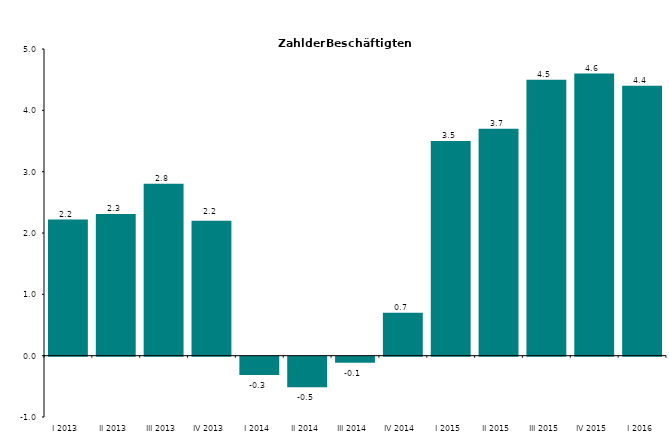
| Category | Series 0 |
|---|---|
| I 2013 | 2.218 |
| II 2013 | 2.309 |
| III 2013 | 2.802 |
| IV 2013 | 2.2 |
| I 2014 | -0.3 |
| II 2014 | -0.5 |
| III 2014 | -0.1 |
| IV 2014 | 0.7 |
| I 2015 | 3.5 |
| II 2015 | 3.7 |
| III 2015 | 4.5 |
| IV 2015 | 4.6 |
| I 2016 | 4.4 |